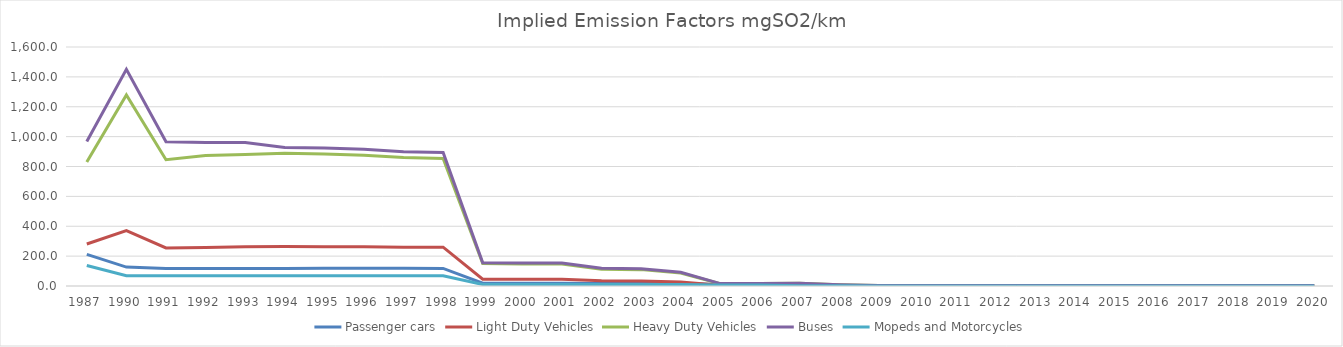
| Category | Passenger cars | Light Duty Vehicles | Heavy Duty Vehicles | Buses | Mopeds and Motorcycles |
|---|---|---|---|---|---|
| 1987.0 | 212.094 | 281.081 | 829.843 | 966.784 | 137.415 |
| 1990.0 | 126.384 | 370.952 | 1279.403 | 1450.965 | 68.708 |
| 1991.0 | 117.766 | 255.094 | 845.29 | 965.366 | 68.707 |
| 1992.0 | 116.467 | 257.133 | 873.365 | 960.329 | 68.708 |
| 1993.0 | 117.289 | 263.439 | 879.826 | 960.272 | 68.708 |
| 1994.0 | 117.854 | 263.902 | 888.136 | 927.814 | 68.708 |
| 1995.0 | 118.412 | 263.48 | 882.947 | 923.847 | 68.707 |
| 1996.0 | 119.137 | 263.375 | 875.241 | 914.857 | 68.709 |
| 1997.0 | 118.527 | 259.935 | 860.232 | 898.614 | 68.708 |
| 1998.0 | 117.711 | 260.068 | 853.866 | 893.679 | 68.709 |
| 1999.0 | 18.268 | 45.167 | 149.746 | 154.942 | 10.306 |
| 2000.0 | 18.108 | 44.945 | 147.78 | 154.115 | 10.161 |
| 2001.0 | 18.108 | 44.754 | 146.578 | 153.485 | 10.06 |
| 2002.0 | 17.103 | 34.412 | 112.612 | 118.364 | 9.988 |
| 2003.0 | 17.113 | 33.329 | 109.606 | 114.812 | 9.944 |
| 2004.0 | 16.438 | 26.646 | 87.429 | 91.535 | 9.817 |
| 2005.0 | 10.211 | 4.837 | 15.731 | 16.281 | 7.072 |
| 2006.0 | 9.882 | 4.883 | 15.904 | 16.449 | 6.772 |
| 2007.0 | 4.041 | 5.443 | 17.741 | 18.384 | 2.411 |
| 2008.0 | 1.525 | 2.41 | 7.767 | 8.067 | 0.886 |
| 2009.0 | 0.723 | 0.983 | 3.128 | 3.283 | 0.439 |
| 2010.0 | 0.524 | 0.942 | 3.007 | 3.138 | 0.273 |
| 2011.0 | 0.536 | 0.942 | 2.952 | 3.123 | 0.275 |
| 2012.0 | 0.564 | 0.936 | 2.929 | 3.093 | 0.295 |
| 2013.0 | 0.466 | 0.894 | 2.812 | 2.94 | 0.191 |
| 2014.0 | 0.464 | 0.845 | 2.652 | 2.762 | 0.197 |
| 2015.0 | 0.608 | 0.952 | 2.986 | 3.094 | 0.326 |
| 2016.0 | 0.606 | 0.885 | 2.803 | 2.863 | 0.36 |
| 2017.0 | 0.611 | 0.846 | 2.676 | 2.717 | 0.393 |
| 2018.0 | 0.611 | 0.849 | 2.704 | 2.731 | 0.4 |
| 2019.0 | 0.498 | 0.791 | 2.52 | 2.542 | 0.237 |
| 2020.0 | 0.5 | 0.789 | 2.513 | 2.524 | 0.239 |